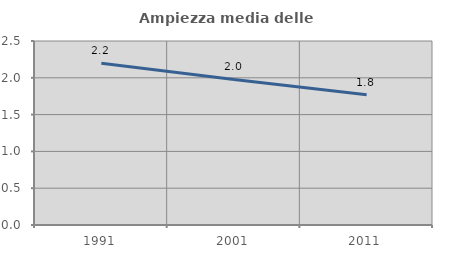
| Category | Ampiezza media delle famiglie |
|---|---|
| 1991.0 | 2.197 |
| 2001.0 | 1.977 |
| 2011.0 | 1.769 |